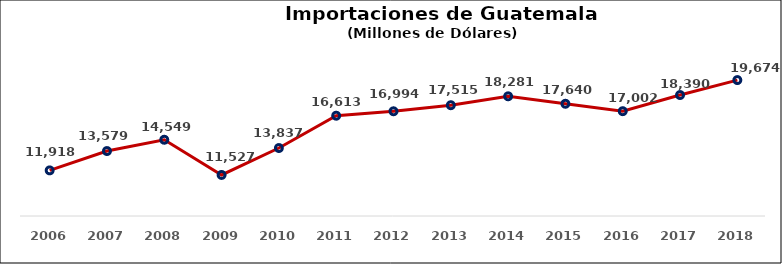
| Category | Series 0 |
|---|---|
| 2006 | 11918.308 |
| 2007 | 13578.595 |
| 2008 | 14549.112 |
| 2009 | 11526.518 |
| 2010 | 13837.394 |
| 2011 | 16612.895 |
| 2012 | 16993.943 |
| 2013 | 17514.979 |
| 2014 | 18281.095 |
| 2015 | 17639.742 |
| 2016 | 17002.232 |
| 2017 | 18389.83 |
| 2018 | 19674.353 |